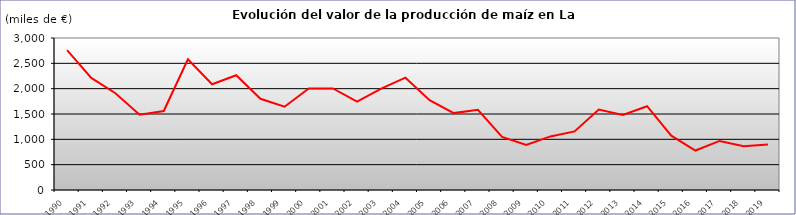
| Category | VALOR 
(miles de €) |
|---|---|
| 1990.0 | 2761.651 |
| 1991.0 | 2212.927 |
| 1992.0 | 1910.016 |
| 1993.0 | 1485.101 |
| 1994.0 | 1558.424 |
| 1995.0 | 2581.287 |
| 1996.0 | 2087.495 |
| 1997.0 | 2264.614 |
| 1998.0 | 1800.031 |
| 1999.0 | 1643.167 |
| 2000.0 | 2003.1 |
| 2001.0 | 2005 |
| 2002.0 | 1745.1 |
| 2003.0 | 1999.8 |
| 2004.0 | 2217.1 |
| 2005.0 | 1774.1 |
| 2006.0 | 1517.9 |
| 2007.0 | 1582.4 |
| 2008.0 | 1049.3 |
| 2009.0 | 888.4 |
| 2010.0 | 1057.8 |
| 2011.0 | 1156.06 |
| 2012.0 | 1587.3 |
| 2013.0 | 1481.92 |
| 2014.0 | 1653.71 |
| 2015.0 | 1072.42 |
| 2016.0 | 779.09 |
| 2017.0 | 968.39 |
| 2018.0 | 863.78 |
| 2019.0 | 898.41 |